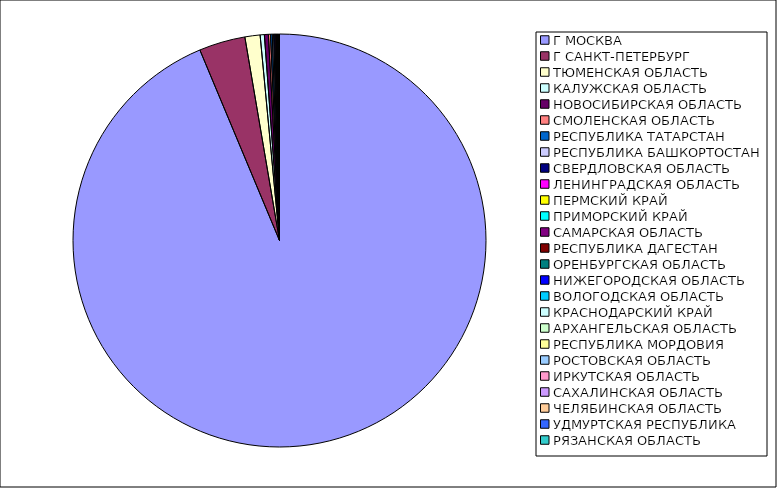
| Category | Оборот |
|---|---|
| Г МОСКВА | 0.936 |
| Г САНКТ-ПЕТЕРБУРГ | 0.036 |
| ТЮМЕНСКАЯ ОБЛАСТЬ | 0.012 |
| КАЛУЖСКАЯ ОБЛАСТЬ | 0.003 |
| НОВОСИБИРСКАЯ ОБЛАСТЬ | 0.003 |
| СМОЛЕНСКАЯ ОБЛАСТЬ | 0.002 |
| РЕСПУБЛИКА ТАТАРСТАН | 0.001 |
| РЕСПУБЛИКА БАШКОРТОСТАН | 0.001 |
| СВЕРДЛОВСКАЯ ОБЛАСТЬ | 0.001 |
| ЛЕНИНГРАДСКАЯ ОБЛАСТЬ | 0.001 |
| ПЕРМСКИЙ КРАЙ | 0 |
| ПРИМОРСКИЙ КРАЙ | 0 |
| САМАРСКАЯ ОБЛАСТЬ | 0 |
| РЕСПУБЛИКА ДАГЕСТАН | 0 |
| ОРЕНБУРГСКАЯ ОБЛАСТЬ | 0 |
| НИЖЕГОРОДСКАЯ ОБЛАСТЬ | 0 |
| ВОЛОГОДСКАЯ ОБЛАСТЬ | 0 |
| КРАСНОДАРСКИЙ КРАЙ | 0 |
| АРХАНГЕЛЬСКАЯ ОБЛАСТЬ | 0 |
| РЕСПУБЛИКА МОРДОВИЯ | 0 |
| РОСТОВСКАЯ ОБЛАСТЬ | 0 |
| ИРКУТСКАЯ ОБЛАСТЬ | 0 |
| САХАЛИНСКАЯ ОБЛАСТЬ | 0 |
| ЧЕЛЯБИНСКАЯ ОБЛАСТЬ | 0 |
| УДМУРТСКАЯ РЕСПУБЛИКА | 0 |
| РЯЗАНСКАЯ ОБЛАСТЬ | 0 |